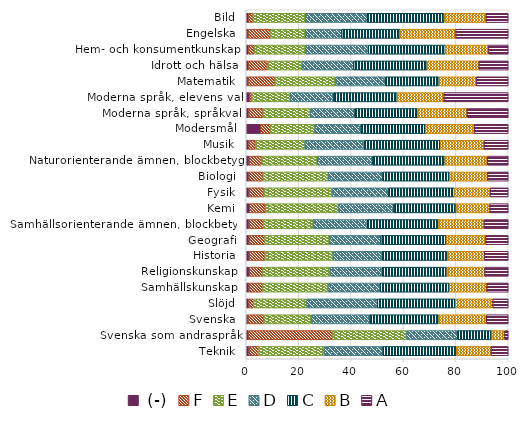
| Category |  (-) | F | E | D | C | B | A |
|---|---|---|---|---|---|---|---|
| Teknik | 1.055 | 3.694 | 24.983 | 22.431 | 27.984 | 13.269 | 6.584 |
| Svenska som andraspråk | 0.752 | 32.253 | 28.149 | 19.524 | 13.044 | 4.867 | 1.412 |
| Svenska | 0.676 | 6.103 | 18.129 | 22.132 | 26.419 | 18.16 | 8.381 |
| Slöjd | 0.981 | 1.824 | 20.217 | 27.009 | 29.778 | 14.267 | 5.924 |
| Samhällskunskap | 1.036 | 5.226 | 24.9 | 19.929 | 26.367 | 14.356 | 8.186 |
| Religionskunskap | 1.127 | 5.131 | 25.73 | 19.783 | 24.838 | 14.369 | 9.022 |
| Historia | 1.102 | 6.017 | 25.958 | 18.814 | 24.818 | 14.175 | 9.117 |
| Geografi | 1.047 | 5.976 | 24.735 | 19.608 | 24.931 | 15.058 | 8.645 |
| Samhällsorienterande ämnen, blockbetyg | 1.076 | 5.508 | 18.932 | 20.598 | 27.15 | 17.481 | 9.255 |
| Kemi | 1.154 | 6.102 | 27.93 | 20.981 | 23.914 | 12.826 | 7.093 |
| Fysik | 1.063 | 5.744 | 25.899 | 21.53 | 25.26 | 13.556 | 6.948 |
| Biologi | 1.043 | 5.326 | 24.912 | 20.847 | 25.514 | 14.42 | 7.939 |
| Naturorienterande ämnen, blockbetyg | 1.094 | 4.89 | 21.094 | 21.043 | 27.62 | 16.19 | 8.07 |
| Musik | 0.977 | 2.487 | 18.896 | 22.599 | 29.151 | 16.611 | 9.279 |
| Modersmål | 5.362 | 3.856 | 16.925 | 17.492 | 24.812 | 18.601 | 12.952 |
| Moderna språk, språkval | 0.94 | 5.428 | 18.085 | 16.84 | 24.103 | 18.833 | 15.772 |
| Moderna språk, elevens val | 1.309 | 0.785 | 14.66 | 16.492 | 24.346 | 17.801 | 24.607 |
| Matematik | 0.689 | 10.244 | 23.186 | 18.975 | 20.482 | 14.151 | 12.273 |
| Idrott och hälsa | 0.842 | 7.234 | 13.119 | 19.799 | 27.982 | 19.81 | 11.214 |
| Hem- och konsumentkunskap | 0.86 | 2.187 | 19.652 | 23.865 | 29.427 | 16.423 | 7.586 |
| Engelska | 0.707 | 8.578 | 13.218 | 13.933 | 22.309 | 21.195 | 20.061 |
| Bild | 0.804 | 1.77 | 19.967 | 23.627 | 29.365 | 15.94 | 8.528 |